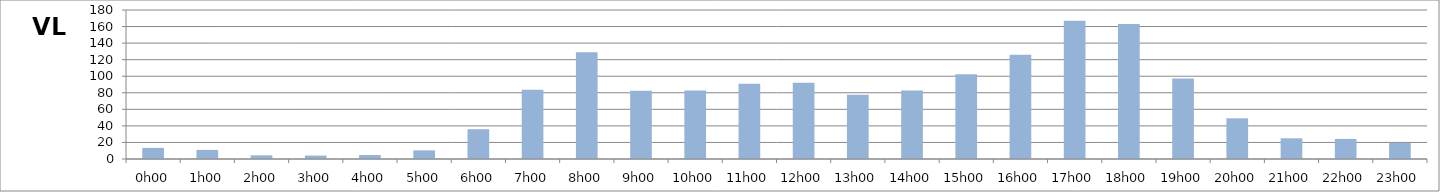
| Category | VL |
|---|---|
| 0.0 | 13.429 |
| 0.041666666666666664 | 11 |
| 0.08333333333333333 | 4.429 |
| 0.125 | 4.143 |
| 0.16666666666666666 | 4.857 |
| 0.20833333333333334 | 10.429 |
| 0.25 | 36 |
| 0.2916666666666667 | 83.571 |
| 0.3333333333333333 | 128.857 |
| 0.375 | 82.571 |
| 0.4166666666666667 | 82.857 |
| 0.4583333333333333 | 91 |
| 0.5 | 92.143 |
| 0.5416666666666666 | 77.571 |
| 0.5833333333333334 | 82.714 |
| 0.625 | 102.286 |
| 0.6666666666666666 | 125.857 |
| 0.7083333333333334 | 167 |
| 0.75 | 163.143 |
| 0.7916666666666666 | 97.143 |
| 0.8333333333333334 | 49.143 |
| 0.875 | 25 |
| 0.9166666666666666 | 24.286 |
| 0.9583333333333334 | 19.571 |